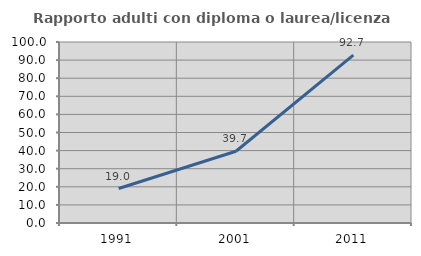
| Category | Rapporto adulti con diploma o laurea/licenza media  |
|---|---|
| 1991.0 | 19.048 |
| 2001.0 | 39.655 |
| 2011.0 | 92.727 |